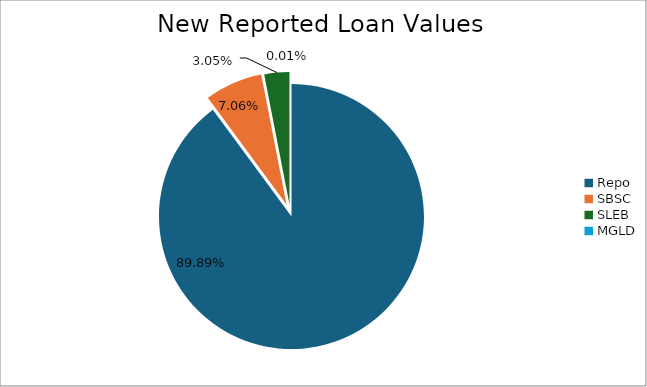
| Category | Series 0 |
|---|---|
| Repo | 13404924.94 |
| SBSC | 1052496.486 |
| SLEB | 455078.241 |
| MGLD | 779.588 |